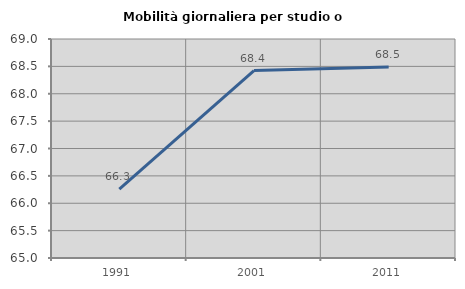
| Category | Mobilità giornaliera per studio o lavoro |
|---|---|
| 1991.0 | 66.259 |
| 2001.0 | 68.423 |
| 2011.0 | 68.491 |